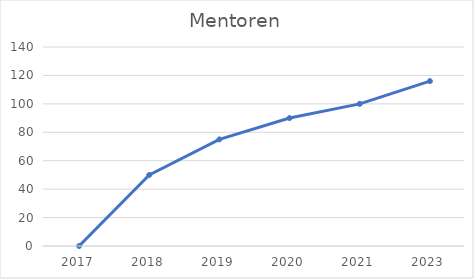
| Category | Mentoren |
|---|---|
| 2017.0 | 0 |
| 2018.0 | 50 |
| 2019.0 | 75 |
| 2020.0 | 90 |
| 2021.0 | 100 |
| 2023.0 | 116 |